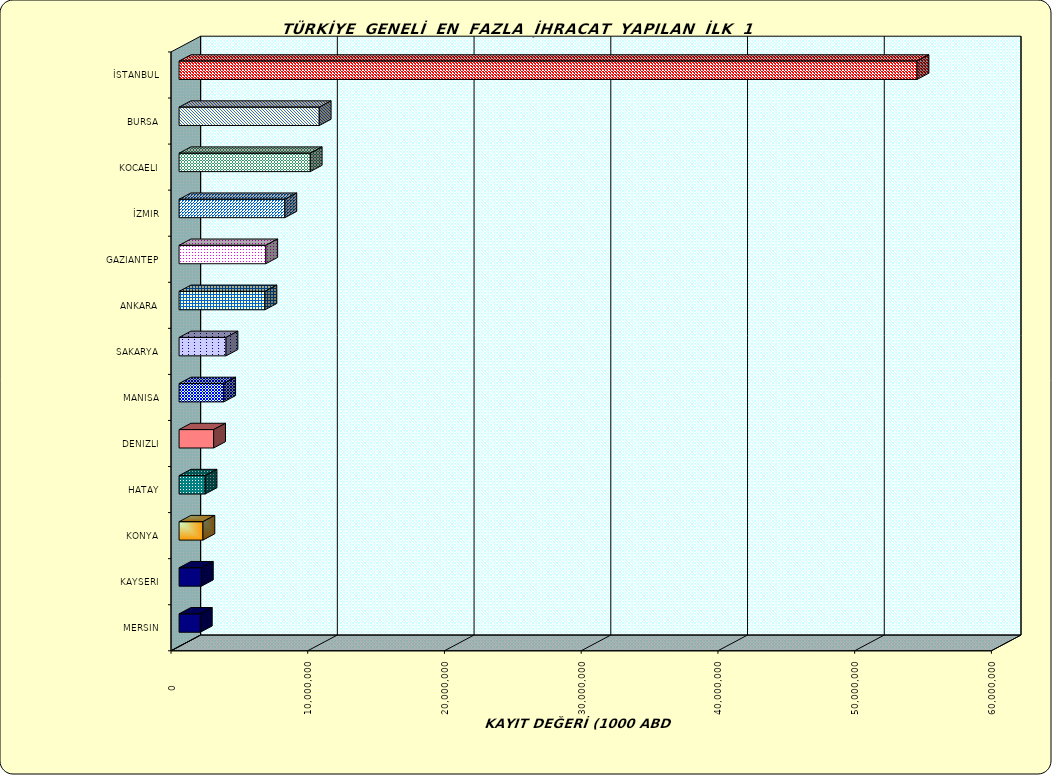
| Category | Series 0 |
|---|---|
| İSTANBUL | 53971354.549 |
| BURSA | 10252383.041 |
| KOCAELI | 9594954.686 |
| İZMIR | 7738803.443 |
| GAZIANTEP | 6342587.976 |
| ANKARA | 6282000.26 |
| SAKARYA | 3434747.976 |
| MANISA | 3265866.672 |
| DENIZLI | 2528641.912 |
| HATAY | 1903483.797 |
| KONYA | 1745098.234 |
| KAYSERI | 1632591.73 |
| MERSIN | 1555006.834 |